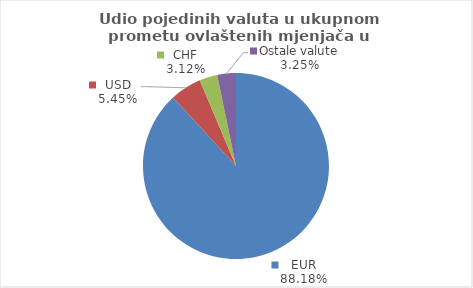
| Category | Series 0 |
|---|---|
| EUR | 88.175 |
| USD | 5.449 |
| CHF | 3.123 |
| Ostale valute | 3.254 |